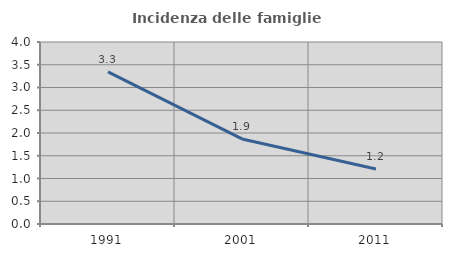
| Category | Incidenza delle famiglie numerose |
|---|---|
| 1991.0 | 3.344 |
| 2001.0 | 1.869 |
| 2011.0 | 1.208 |